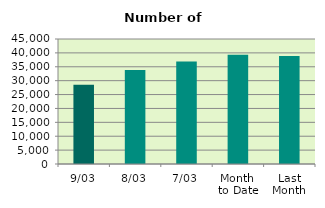
| Category | Series 0 |
|---|---|
| 9/03 | 28538 |
| 8/03 | 33820 |
| 7/03 | 36892 |
| Month 
to Date | 39330.286 |
| Last
Month | 38877.2 |